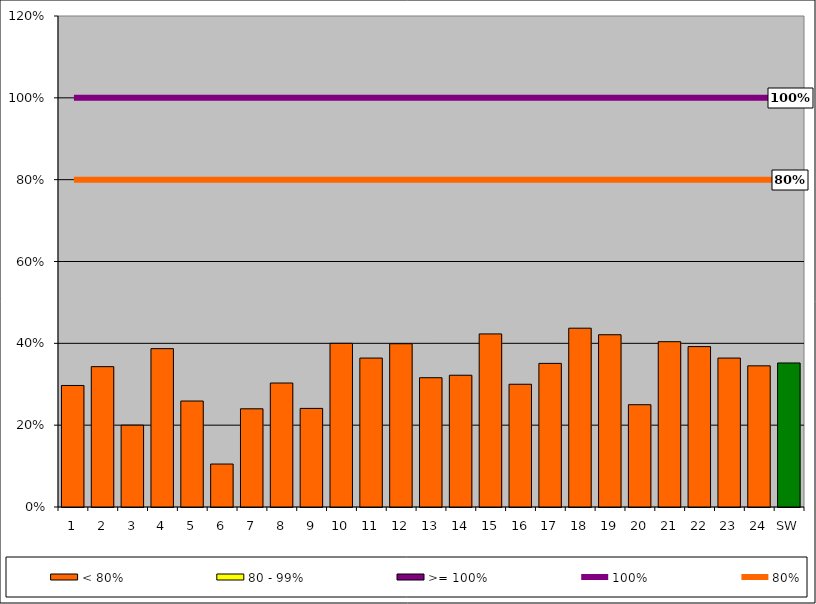
| Category | < 80% | 80 - 99% | >= 100% |
|---|---|---|---|
| 1 | 0.297 | 0 | 0 |
| 2 | 0.343 | 0 | 0 |
| 3 | 0.2 | 0 | 0 |
| 4 | 0.387 | 0 | 0 |
| 5 | 0.259 | 0 | 0 |
| 6 | 0.105 | 0 | 0 |
| 7 | 0.24 | 0 | 0 |
| 8 | 0.303 | 0 | 0 |
| 9 | 0.241 | 0 | 0 |
| 10 | 0.4 | 0 | 0 |
| 11 | 0.364 | 0 | 0 |
| 12 | 0.399 | 0 | 0 |
| 13 | 0.316 | 0 | 0 |
| 14 | 0.322 | 0 | 0 |
| 15 | 0.423 | 0 | 0 |
| 16 | 0.3 | 0 | 0 |
| 17 | 0.351 | 0 | 0 |
| 18 | 0.437 | 0 | 0 |
| 19 | 0.421 | 0 | 0 |
| 20 | 0.25 | 0 | 0 |
| 21 | 0.404 | 0 | 0 |
| 22 | 0.392 | 0 | 0 |
| 23 | 0.364 | 0 | 0 |
| 24 | 0.345 | 0 | 0 |
| SW | 0.352 | 0 | 0 |